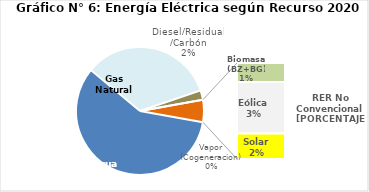
| Category | Series 0 |
|---|---|
| Agua | 2848.971 |
| Gas Natural | 1649.683 |
| Diesel/Residual/Carbón | 117.211 |
| Vapor (Cogeneracion) | 0.245 |
| Biomasa (BZ+BG) | 54.85 |
| Eólica | 148.14 |
| Solar | 73.797 |